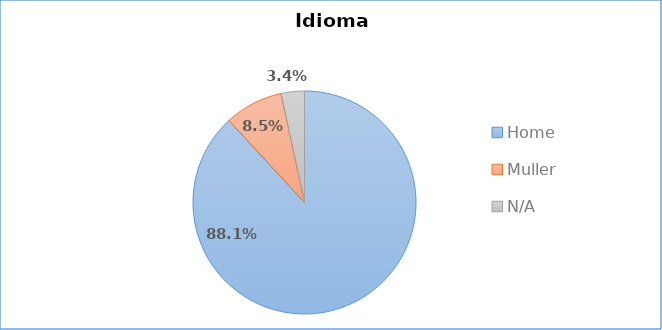
| Category | Idioma empregado |
|---|---|
| Home | 0.881 |
| Muller | 0.085 |
| N/A | 0.034 |